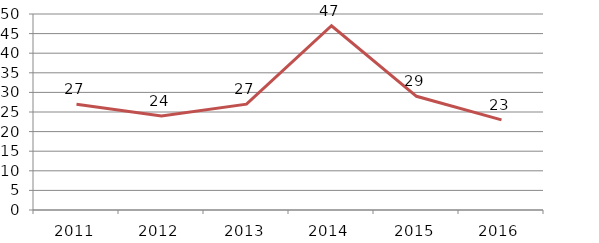
| Category | Contratos |
|---|---|
| 2011.0 | 27 |
| 2012.0 | 24 |
| 2013.0 | 27 |
| 2014.0 | 47 |
| 2015.0 | 29 |
| 2016.0 | 23 |